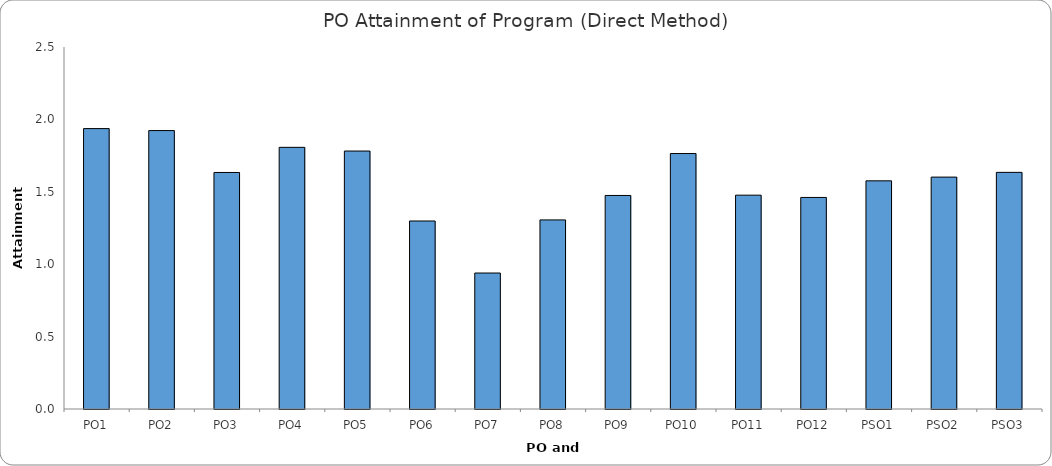
| Category | PO1 PO2 PO3 PO4 PO5 PO6 PO7 PO8 PO9 PO10 PO11 PO12 PSO1 PSO2 PSO3 |
|---|---|
| PO1 | 1.937 |
| PO2 | 1.923 |
| PO3 | 1.633 |
| PO4 | 1.807 |
| PO5 | 1.781 |
| PO6 | 1.298 |
| PO7 | 0.939 |
| PO8 | 1.306 |
| PO9 | 1.475 |
| PO10 | 1.764 |
| PO11 | 1.477 |
| PO12 | 1.461 |
| PSO1 | 1.576 |
| PSO2 | 1.601 |
| PSO3 | 1.634 |